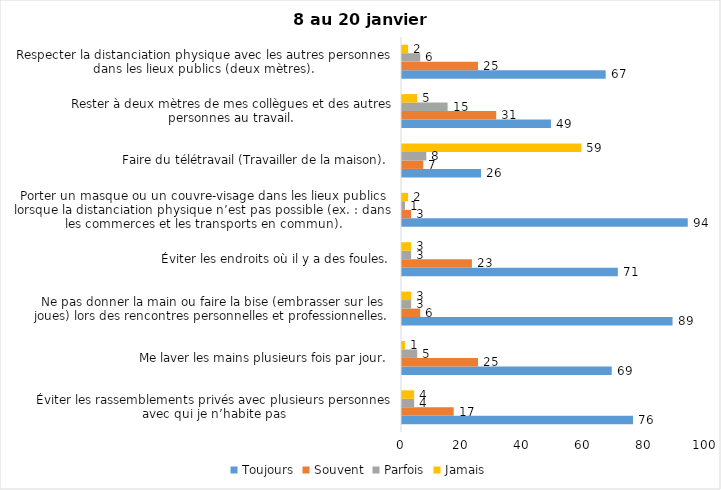
| Category | Toujours | Souvent | Parfois | Jamais |
|---|---|---|---|---|
| Éviter les rassemblements privés avec plusieurs personnes avec qui je n’habite pas | 76 | 17 | 4 | 4 |
| Me laver les mains plusieurs fois par jour. | 69 | 25 | 5 | 1 |
| Ne pas donner la main ou faire la bise (embrasser sur les joues) lors des rencontres personnelles et professionnelles. | 89 | 6 | 3 | 3 |
| Éviter les endroits où il y a des foules. | 71 | 23 | 3 | 3 |
| Porter un masque ou un couvre-visage dans les lieux publics lorsque la distanciation physique n’est pas possible (ex. : dans les commerces et les transports en commun). | 94 | 3 | 1 | 2 |
| Faire du télétravail (Travailler de la maison). | 26 | 7 | 8 | 59 |
| Rester à deux mètres de mes collègues et des autres personnes au travail. | 49 | 31 | 15 | 5 |
| Respecter la distanciation physique avec les autres personnes dans les lieux publics (deux mètres). | 67 | 25 | 6 | 2 |